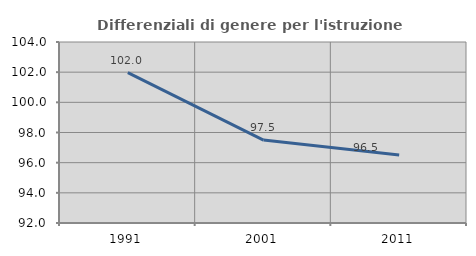
| Category | Differenziali di genere per l'istruzione superiore |
|---|---|
| 1991.0 | 101.975 |
| 2001.0 | 97.499 |
| 2011.0 | 96.509 |